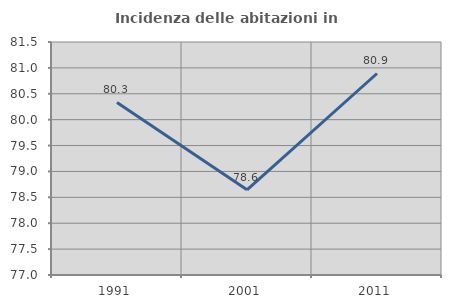
| Category | Incidenza delle abitazioni in proprietà  |
|---|---|
| 1991.0 | 80.333 |
| 2001.0 | 78.646 |
| 2011.0 | 80.892 |